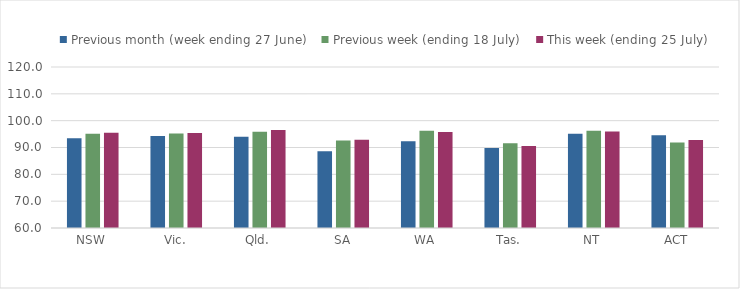
| Category | Previous month (week ending 27 June) | Previous week (ending 18 July) | This week (ending 25 July) |
|---|---|---|---|
| NSW | 93.421 | 95.158 | 95.478 |
| Vic. | 94.332 | 95.227 | 95.414 |
| Qld. | 94.032 | 95.897 | 96.506 |
| SA | 88.646 | 92.61 | 92.92 |
| WA | 92.341 | 96.239 | 95.819 |
| Tas. | 89.812 | 91.615 | 90.536 |
| NT | 95.129 | 96.275 | 96.009 |
| ACT | 94.574 | 91.86 | 92.808 |